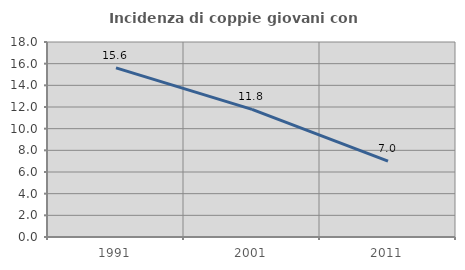
| Category | Incidenza di coppie giovani con figli |
|---|---|
| 1991.0 | 15.609 |
| 2001.0 | 11.78 |
| 2011.0 | 6.998 |